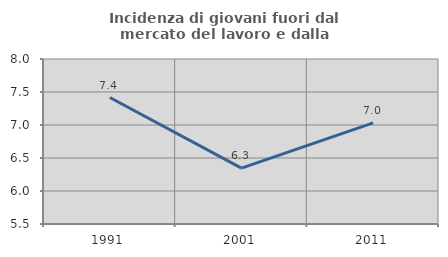
| Category | Incidenza di giovani fuori dal mercato del lavoro e dalla formazione  |
|---|---|
| 1991.0 | 7.416 |
| 2001.0 | 6.346 |
| 2011.0 | 7.032 |